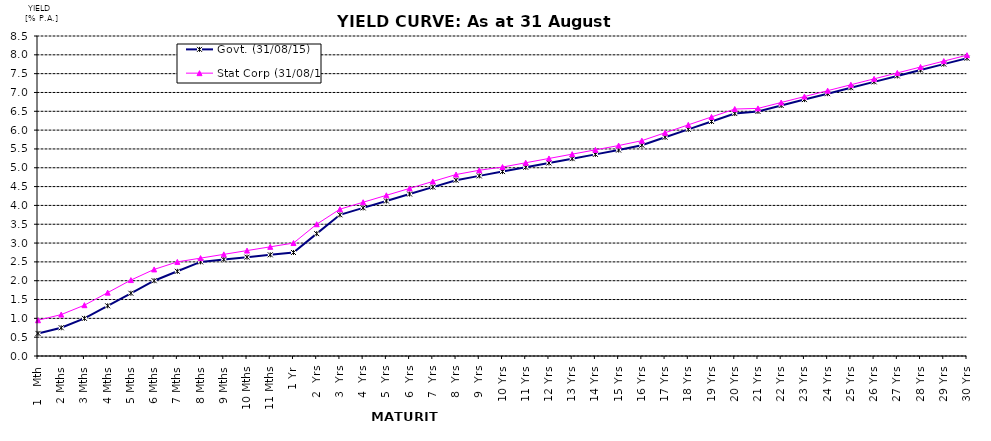
| Category | Govt. (31/08/15) | Stat Corp (31/08/15) |
|---|---|---|
| 1   Mth | 0.6 | 0.95 |
| 2 Mths | 0.75 | 1.1 |
| 3 Mths | 1 | 1.35 |
| 4 Mths | 1.333 | 1.683 |
| 5 Mths | 1.667 | 2.017 |
| 6 Mths | 2 | 2.3 |
| 7 Mths | 2.25 | 2.5 |
| 8 Mths | 2.5 | 2.6 |
| 9 Mths | 2.562 | 2.7 |
| 10 Mths | 2.625 | 2.8 |
| 11 Mths | 2.688 | 2.9 |
| 1 Yr | 2.75 | 3 |
| 2  Yrs | 3.25 | 3.5 |
| 3  Yrs | 3.75 | 3.9 |
| 4  Yrs | 3.934 | 4.084 |
| 5  Yrs | 4.118 | 4.268 |
| 6  Yrs | 4.302 | 4.452 |
| 7  Yrs | 4.486 | 4.636 |
| 8  Yrs | 4.67 | 4.82 |
| 9  Yrs | 4.784 | 4.934 |
| 10 Yrs | 4.899 | 5.019 |
| 11 Yrs | 5.013 | 5.133 |
| 12 Yrs | 5.127 | 5.247 |
| 13 Yrs | 5.241 | 5.361 |
| 14 Yrs | 5.356 | 5.476 |
| 15 Yrs | 5.47 | 5.59 |
| 16 Yrs | 5.6 | 5.72 |
| 17 Yrs | 5.81 | 5.93 |
| 18 Yrs | 6.02 | 6.14 |
| 19 Yrs | 6.23 | 6.35 |
| 20 Yrs | 6.44 | 6.56 |
| 21 Yrs | 6.497 | 6.577 |
| 22 Yrs | 6.654 | 6.734 |
| 23 Yrs | 6.811 | 6.891 |
| 24 Yrs | 6.968 | 7.048 |
| 25 Yrs | 7.125 | 7.205 |
| 26 Yrs | 7.282 | 7.362 |
| 27 Yrs | 7.439 | 7.519 |
| 28 Yrs | 7.596 | 7.676 |
| 29 Yrs | 7.753 | 7.833 |
| 30 Yrs | 7.91 | 7.99 |